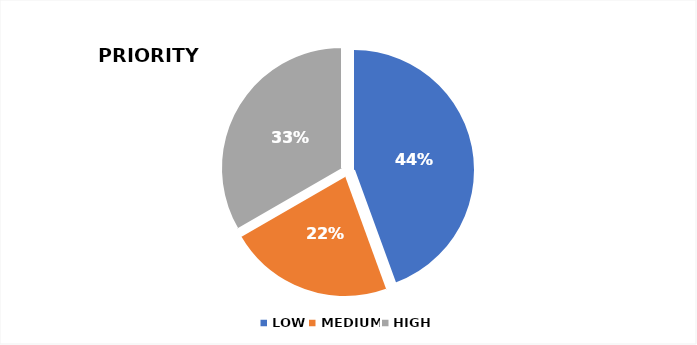
| Category | Series 0 |
|---|---|
| LOW | 4 |
| MEDIUM | 2 |
| HIGH | 3 |